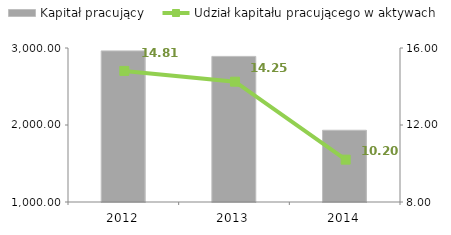
| Category | Kapitał pracujący |
|---|---|
| 2012.0 | 2962.3 |
| 2013.0 | 2890.9 |
| 2014.0 | 1932 |